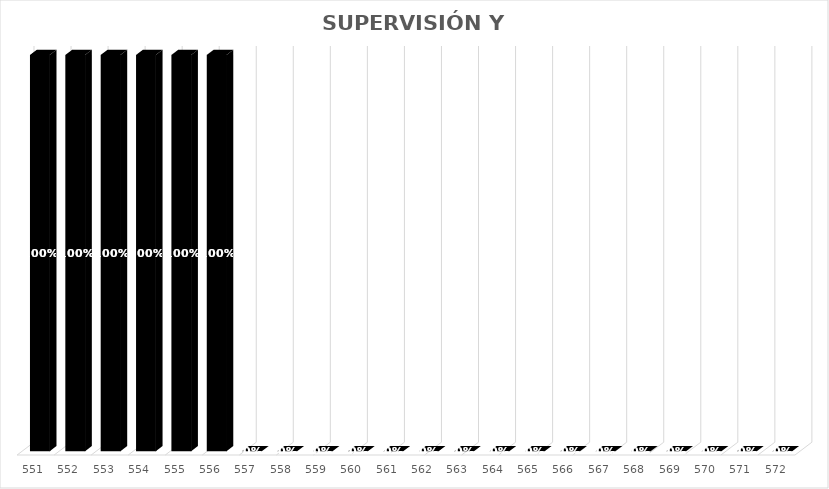
| Category | % Avance |
|---|---|
| 551.0 | 1 |
| 552.0 | 1 |
| 553.0 | 1 |
| 554.0 | 1 |
| 555.0 | 1 |
| 556.0 | 1 |
| 557.0 | 0 |
| 558.0 | 0 |
| 559.0 | 0 |
| 560.0 | 0 |
| 561.0 | 0 |
| 562.0 | 0 |
| 563.0 | 0 |
| 564.0 | 0 |
| 565.0 | 0 |
| 566.0 | 0 |
| 567.0 | 0 |
| 568.0 | 0 |
| 569.0 | 0 |
| 570.0 | 0 |
| 571.0 | 0 |
| 572.0 | 0 |